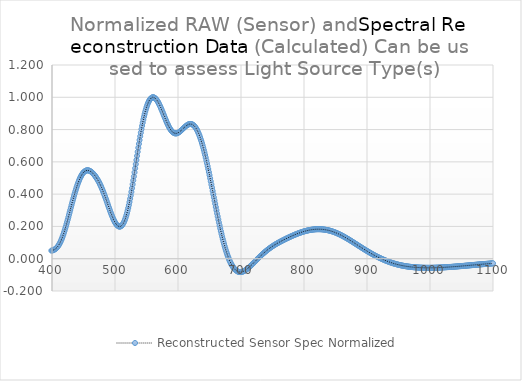
| Category | Reconstructed Sensor Spec Normalized |
|---|---|
| 380.0 | 0.041 |
| 381.0 | 0.041 |
| 382.0 | 0.042 |
| 383.0 | 0.042 |
| 384.0 | 0.042 |
| 385.0 | 0.043 |
| 386.0 | 0.043 |
| 387.0 | 0.044 |
| 388.0 | 0.044 |
| 389.0 | 0.045 |
| 390.0 | 0.045 |
| 391.0 | 0.046 |
| 392.0 | 0.046 |
| 393.0 | 0.047 |
| 394.0 | 0.047 |
| 395.0 | 0.047 |
| 396.0 | 0.048 |
| 397.0 | 0.049 |
| 398.0 | 0.049 |
| 399.0 | 0.05 |
| 400.0 | 0.051 |
| 401.0 | 0.052 |
| 402.0 | 0.053 |
| 403.0 | 0.055 |
| 404.0 | 0.057 |
| 405.0 | 0.059 |
| 406.0 | 0.062 |
| 407.0 | 0.066 |
| 408.0 | 0.07 |
| 409.0 | 0.075 |
| 410.0 | 0.08 |
| 411.0 | 0.086 |
| 412.0 | 0.093 |
| 413.0 | 0.101 |
| 414.0 | 0.109 |
| 415.0 | 0.118 |
| 416.0 | 0.128 |
| 417.0 | 0.138 |
| 418.0 | 0.15 |
| 419.0 | 0.161 |
| 420.0 | 0.174 |
| 421.0 | 0.187 |
| 422.0 | 0.2 |
| 423.0 | 0.214 |
| 424.0 | 0.228 |
| 425.0 | 0.242 |
| 426.0 | 0.257 |
| 427.0 | 0.272 |
| 428.0 | 0.287 |
| 429.0 | 0.302 |
| 430.0 | 0.317 |
| 431.0 | 0.332 |
| 432.0 | 0.347 |
| 433.0 | 0.361 |
| 434.0 | 0.376 |
| 435.0 | 0.39 |
| 436.0 | 0.404 |
| 437.0 | 0.417 |
| 438.0 | 0.43 |
| 439.0 | 0.442 |
| 440.0 | 0.454 |
| 441.0 | 0.465 |
| 442.0 | 0.476 |
| 443.0 | 0.486 |
| 444.0 | 0.495 |
| 445.0 | 0.503 |
| 446.0 | 0.511 |
| 447.0 | 0.518 |
| 448.0 | 0.524 |
| 449.0 | 0.53 |
| 450.0 | 0.535 |
| 451.0 | 0.538 |
| 452.0 | 0.542 |
| 453.0 | 0.544 |
| 454.0 | 0.546 |
| 455.0 | 0.547 |
| 456.0 | 0.548 |
| 457.0 | 0.547 |
| 458.0 | 0.547 |
| 459.0 | 0.546 |
| 460.0 | 0.544 |
| 461.0 | 0.542 |
| 462.0 | 0.539 |
| 463.0 | 0.536 |
| 464.0 | 0.533 |
| 465.0 | 0.529 |
| 466.0 | 0.525 |
| 467.0 | 0.52 |
| 468.0 | 0.515 |
| 469.0 | 0.51 |
| 470.0 | 0.504 |
| 471.0 | 0.498 |
| 472.0 | 0.492 |
| 473.0 | 0.485 |
| 474.0 | 0.478 |
| 475.0 | 0.471 |
| 476.0 | 0.463 |
| 477.0 | 0.455 |
| 478.0 | 0.446 |
| 479.0 | 0.437 |
| 480.0 | 0.428 |
| 481.0 | 0.418 |
| 482.0 | 0.408 |
| 483.0 | 0.397 |
| 484.0 | 0.387 |
| 485.0 | 0.376 |
| 486.0 | 0.365 |
| 487.0 | 0.354 |
| 488.0 | 0.343 |
| 489.0 | 0.332 |
| 490.0 | 0.32 |
| 491.0 | 0.309 |
| 492.0 | 0.299 |
| 493.0 | 0.288 |
| 494.0 | 0.278 |
| 495.0 | 0.268 |
| 496.0 | 0.258 |
| 497.0 | 0.249 |
| 498.0 | 0.241 |
| 499.0 | 0.233 |
| 500.0 | 0.225 |
| 501.0 | 0.219 |
| 502.0 | 0.213 |
| 503.0 | 0.209 |
| 504.0 | 0.205 |
| 505.0 | 0.202 |
| 506.0 | 0.2 |
| 507.0 | 0.199 |
| 508.0 | 0.199 |
| 509.0 | 0.2 |
| 510.0 | 0.203 |
| 511.0 | 0.207 |
| 512.0 | 0.212 |
| 513.0 | 0.218 |
| 514.0 | 0.225 |
| 515.0 | 0.234 |
| 516.0 | 0.244 |
| 517.0 | 0.255 |
| 518.0 | 0.268 |
| 519.0 | 0.282 |
| 520.0 | 0.298 |
| 521.0 | 0.314 |
| 522.0 | 0.332 |
| 523.0 | 0.351 |
| 524.0 | 0.371 |
| 525.0 | 0.392 |
| 526.0 | 0.414 |
| 527.0 | 0.437 |
| 528.0 | 0.461 |
| 529.0 | 0.485 |
| 530.0 | 0.51 |
| 531.0 | 0.535 |
| 532.0 | 0.56 |
| 533.0 | 0.586 |
| 534.0 | 0.611 |
| 535.0 | 0.637 |
| 536.0 | 0.662 |
| 537.0 | 0.687 |
| 538.0 | 0.711 |
| 539.0 | 0.735 |
| 540.0 | 0.758 |
| 541.0 | 0.781 |
| 542.0 | 0.802 |
| 543.0 | 0.823 |
| 544.0 | 0.843 |
| 545.0 | 0.861 |
| 546.0 | 0.879 |
| 547.0 | 0.895 |
| 548.0 | 0.911 |
| 549.0 | 0.925 |
| 550.0 | 0.938 |
| 551.0 | 0.949 |
| 552.0 | 0.96 |
| 553.0 | 0.969 |
| 554.0 | 0.977 |
| 555.0 | 0.984 |
| 556.0 | 0.989 |
| 557.0 | 0.994 |
| 558.0 | 0.997 |
| 559.0 | 0.999 |
| 560.0 | 1 |
| 561.0 | 1 |
| 562.0 | 0.999 |
| 563.0 | 0.997 |
| 564.0 | 0.993 |
| 565.0 | 0.989 |
| 566.0 | 0.985 |
| 567.0 | 0.979 |
| 568.0 | 0.973 |
| 569.0 | 0.966 |
| 570.0 | 0.958 |
| 571.0 | 0.95 |
| 572.0 | 0.942 |
| 573.0 | 0.933 |
| 574.0 | 0.923 |
| 575.0 | 0.914 |
| 576.0 | 0.904 |
| 577.0 | 0.894 |
| 578.0 | 0.885 |
| 579.0 | 0.875 |
| 580.0 | 0.865 |
| 581.0 | 0.856 |
| 582.0 | 0.847 |
| 583.0 | 0.838 |
| 584.0 | 0.83 |
| 585.0 | 0.822 |
| 586.0 | 0.814 |
| 587.0 | 0.807 |
| 588.0 | 0.801 |
| 589.0 | 0.795 |
| 590.0 | 0.791 |
| 591.0 | 0.786 |
| 592.0 | 0.783 |
| 593.0 | 0.78 |
| 594.0 | 0.778 |
| 595.0 | 0.777 |
| 596.0 | 0.776 |
| 597.0 | 0.776 |
| 598.0 | 0.777 |
| 599.0 | 0.778 |
| 600.0 | 0.78 |
| 601.0 | 0.782 |
| 602.0 | 0.785 |
| 603.0 | 0.788 |
| 604.0 | 0.791 |
| 605.0 | 0.795 |
| 606.0 | 0.798 |
| 607.0 | 0.802 |
| 608.0 | 0.806 |
| 609.0 | 0.81 |
| 610.0 | 0.813 |
| 611.0 | 0.817 |
| 612.0 | 0.82 |
| 613.0 | 0.823 |
| 614.0 | 0.826 |
| 615.0 | 0.829 |
| 616.0 | 0.831 |
| 617.0 | 0.833 |
| 618.0 | 0.834 |
| 619.0 | 0.834 |
| 620.0 | 0.835 |
| 621.0 | 0.834 |
| 622.0 | 0.833 |
| 623.0 | 0.831 |
| 624.0 | 0.829 |
| 625.0 | 0.826 |
| 626.0 | 0.822 |
| 627.0 | 0.817 |
| 628.0 | 0.812 |
| 629.0 | 0.806 |
| 630.0 | 0.799 |
| 631.0 | 0.791 |
| 632.0 | 0.783 |
| 633.0 | 0.773 |
| 634.0 | 0.763 |
| 635.0 | 0.753 |
| 636.0 | 0.741 |
| 637.0 | 0.729 |
| 638.0 | 0.716 |
| 639.0 | 0.703 |
| 640.0 | 0.689 |
| 641.0 | 0.674 |
| 642.0 | 0.658 |
| 643.0 | 0.642 |
| 644.0 | 0.626 |
| 645.0 | 0.609 |
| 646.0 | 0.592 |
| 647.0 | 0.574 |
| 648.0 | 0.556 |
| 649.0 | 0.537 |
| 650.0 | 0.518 |
| 651.0 | 0.499 |
| 652.0 | 0.479 |
| 653.0 | 0.46 |
| 654.0 | 0.44 |
| 655.0 | 0.42 |
| 656.0 | 0.4 |
| 657.0 | 0.38 |
| 658.0 | 0.36 |
| 659.0 | 0.34 |
| 660.0 | 0.32 |
| 661.0 | 0.301 |
| 662.0 | 0.281 |
| 663.0 | 0.262 |
| 664.0 | 0.243 |
| 665.0 | 0.224 |
| 666.0 | 0.206 |
| 667.0 | 0.188 |
| 668.0 | 0.171 |
| 669.0 | 0.154 |
| 670.0 | 0.138 |
| 671.0 | 0.122 |
| 672.0 | 0.107 |
| 673.0 | 0.093 |
| 674.0 | 0.079 |
| 675.0 | 0.065 |
| 676.0 | 0.052 |
| 677.0 | 0.04 |
| 678.0 | 0.028 |
| 679.0 | 0.017 |
| 680.0 | 0.007 |
| 681.0 | -0.003 |
| 682.0 | -0.012 |
| 683.0 | -0.021 |
| 684.0 | -0.029 |
| 685.0 | -0.036 |
| 686.0 | -0.043 |
| 687.0 | -0.049 |
| 688.0 | -0.055 |
| 689.0 | -0.06 |
| 690.0 | -0.065 |
| 691.0 | -0.069 |
| 692.0 | -0.072 |
| 693.0 | -0.075 |
| 694.0 | -0.077 |
| 695.0 | -0.079 |
| 696.0 | -0.081 |
| 697.0 | -0.082 |
| 698.0 | -0.082 |
| 699.0 | -0.083 |
| 700.0 | -0.082 |
| 701.0 | -0.082 |
| 702.0 | -0.081 |
| 703.0 | -0.079 |
| 704.0 | -0.078 |
| 705.0 | -0.076 |
| 706.0 | -0.074 |
| 707.0 | -0.071 |
| 708.0 | -0.069 |
| 709.0 | -0.066 |
| 710.0 | -0.063 |
| 711.0 | -0.059 |
| 712.0 | -0.056 |
| 713.0 | -0.053 |
| 714.0 | -0.049 |
| 715.0 | -0.045 |
| 716.0 | -0.042 |
| 717.0 | -0.038 |
| 718.0 | -0.034 |
| 719.0 | -0.03 |
| 720.0 | -0.026 |
| 721.0 | -0.022 |
| 722.0 | -0.018 |
| 723.0 | -0.014 |
| 724.0 | -0.01 |
| 725.0 | -0.006 |
| 726.0 | -0.002 |
| 727.0 | 0.002 |
| 728.0 | 0.005 |
| 729.0 | 0.009 |
| 730.0 | 0.013 |
| 731.0 | 0.017 |
| 732.0 | 0.02 |
| 733.0 | 0.024 |
| 734.0 | 0.028 |
| 735.0 | 0.031 |
| 736.0 | 0.035 |
| 737.0 | 0.038 |
| 738.0 | 0.042 |
| 739.0 | 0.045 |
| 740.0 | 0.048 |
| 741.0 | 0.051 |
| 742.0 | 0.054 |
| 743.0 | 0.058 |
| 744.0 | 0.061 |
| 745.0 | 0.063 |
| 746.0 | 0.066 |
| 747.0 | 0.069 |
| 748.0 | 0.072 |
| 749.0 | 0.075 |
| 750.0 | 0.077 |
| 751.0 | 0.08 |
| 752.0 | 0.082 |
| 753.0 | 0.085 |
| 754.0 | 0.087 |
| 755.0 | 0.089 |
| 756.0 | 0.092 |
| 757.0 | 0.094 |
| 758.0 | 0.096 |
| 759.0 | 0.098 |
| 760.0 | 0.101 |
| 761.0 | 0.103 |
| 762.0 | 0.105 |
| 763.0 | 0.107 |
| 764.0 | 0.109 |
| 765.0 | 0.111 |
| 766.0 | 0.113 |
| 767.0 | 0.115 |
| 768.0 | 0.117 |
| 769.0 | 0.119 |
| 770.0 | 0.121 |
| 771.0 | 0.123 |
| 772.0 | 0.125 |
| 773.0 | 0.127 |
| 774.0 | 0.128 |
| 775.0 | 0.13 |
| 776.0 | 0.132 |
| 777.0 | 0.134 |
| 778.0 | 0.136 |
| 779.0 | 0.138 |
| 780.0 | 0.139 |
| 781.0 | 0.141 |
| 782.0 | 0.143 |
| 783.0 | 0.144 |
| 784.0 | 0.146 |
| 785.0 | 0.148 |
| 786.0 | 0.149 |
| 787.0 | 0.151 |
| 788.0 | 0.153 |
| 789.0 | 0.154 |
| 790.0 | 0.156 |
| 791.0 | 0.157 |
| 792.0 | 0.159 |
| 793.0 | 0.16 |
| 794.0 | 0.161 |
| 795.0 | 0.163 |
| 796.0 | 0.164 |
| 797.0 | 0.165 |
| 798.0 | 0.167 |
| 799.0 | 0.168 |
| 800.0 | 0.169 |
| 801.0 | 0.17 |
| 802.0 | 0.171 |
| 803.0 | 0.172 |
| 804.0 | 0.173 |
| 805.0 | 0.174 |
| 806.0 | 0.175 |
| 807.0 | 0.176 |
| 808.0 | 0.177 |
| 809.0 | 0.178 |
| 810.0 | 0.178 |
| 811.0 | 0.179 |
| 812.0 | 0.18 |
| 813.0 | 0.18 |
| 814.0 | 0.181 |
| 815.0 | 0.181 |
| 816.0 | 0.182 |
| 817.0 | 0.182 |
| 818.0 | 0.182 |
| 819.0 | 0.182 |
| 820.0 | 0.183 |
| 821.0 | 0.183 |
| 822.0 | 0.183 |
| 823.0 | 0.183 |
| 824.0 | 0.183 |
| 825.0 | 0.183 |
| 826.0 | 0.183 |
| 827.0 | 0.182 |
| 828.0 | 0.182 |
| 829.0 | 0.182 |
| 830.0 | 0.182 |
| 831.0 | 0.181 |
| 832.0 | 0.181 |
| 833.0 | 0.18 |
| 834.0 | 0.179 |
| 835.0 | 0.179 |
| 836.0 | 0.178 |
| 837.0 | 0.177 |
| 838.0 | 0.176 |
| 839.0 | 0.176 |
| 840.0 | 0.175 |
| 841.0 | 0.174 |
| 842.0 | 0.172 |
| 843.0 | 0.171 |
| 844.0 | 0.17 |
| 845.0 | 0.169 |
| 846.0 | 0.168 |
| 847.0 | 0.166 |
| 848.0 | 0.165 |
| 849.0 | 0.163 |
| 850.0 | 0.162 |
| 851.0 | 0.16 |
| 852.0 | 0.158 |
| 853.0 | 0.157 |
| 854.0 | 0.155 |
| 855.0 | 0.153 |
| 856.0 | 0.151 |
| 857.0 | 0.15 |
| 858.0 | 0.148 |
| 859.0 | 0.146 |
| 860.0 | 0.144 |
| 861.0 | 0.142 |
| 862.0 | 0.139 |
| 863.0 | 0.137 |
| 864.0 | 0.135 |
| 865.0 | 0.133 |
| 866.0 | 0.131 |
| 867.0 | 0.128 |
| 868.0 | 0.126 |
| 869.0 | 0.124 |
| 870.0 | 0.122 |
| 871.0 | 0.119 |
| 872.0 | 0.117 |
| 873.0 | 0.114 |
| 874.0 | 0.112 |
| 875.0 | 0.11 |
| 876.0 | 0.107 |
| 877.0 | 0.105 |
| 878.0 | 0.102 |
| 879.0 | 0.1 |
| 880.0 | 0.097 |
| 881.0 | 0.095 |
| 882.0 | 0.092 |
| 883.0 | 0.09 |
| 884.0 | 0.087 |
| 885.0 | 0.085 |
| 886.0 | 0.082 |
| 887.0 | 0.08 |
| 888.0 | 0.077 |
| 889.0 | 0.075 |
| 890.0 | 0.072 |
| 891.0 | 0.07 |
| 892.0 | 0.067 |
| 893.0 | 0.065 |
| 894.0 | 0.062 |
| 895.0 | 0.06 |
| 896.0 | 0.057 |
| 897.0 | 0.055 |
| 898.0 | 0.053 |
| 899.0 | 0.05 |
| 900.0 | 0.048 |
| 901.0 | 0.046 |
| 902.0 | 0.043 |
| 903.0 | 0.041 |
| 904.0 | 0.039 |
| 905.0 | 0.036 |
| 906.0 | 0.034 |
| 907.0 | 0.032 |
| 908.0 | 0.03 |
| 909.0 | 0.027 |
| 910.0 | 0.025 |
| 911.0 | 0.023 |
| 912.0 | 0.021 |
| 913.0 | 0.019 |
| 914.0 | 0.017 |
| 915.0 | 0.015 |
| 916.0 | 0.013 |
| 917.0 | 0.011 |
| 918.0 | 0.009 |
| 919.0 | 0.007 |
| 920.0 | 0.005 |
| 921.0 | 0.003 |
| 922.0 | 0.001 |
| 923.0 | 0 |
| 924.0 | -0.002 |
| 925.0 | -0.004 |
| 926.0 | -0.006 |
| 927.0 | -0.007 |
| 928.0 | -0.009 |
| 929.0 | -0.01 |
| 930.0 | -0.012 |
| 931.0 | -0.014 |
| 932.0 | -0.015 |
| 933.0 | -0.017 |
| 934.0 | -0.018 |
| 935.0 | -0.02 |
| 936.0 | -0.021 |
| 937.0 | -0.022 |
| 938.0 | -0.024 |
| 939.0 | -0.025 |
| 940.0 | -0.026 |
| 941.0 | -0.028 |
| 942.0 | -0.029 |
| 943.0 | -0.03 |
| 944.0 | -0.031 |
| 945.0 | -0.032 |
| 946.0 | -0.033 |
| 947.0 | -0.034 |
| 948.0 | -0.035 |
| 949.0 | -0.036 |
| 950.0 | -0.037 |
| 951.0 | -0.038 |
| 952.0 | -0.039 |
| 953.0 | -0.04 |
| 954.0 | -0.041 |
| 955.0 | -0.042 |
| 956.0 | -0.043 |
| 957.0 | -0.043 |
| 958.0 | -0.044 |
| 959.0 | -0.045 |
| 960.0 | -0.045 |
| 961.0 | -0.046 |
| 962.0 | -0.047 |
| 963.0 | -0.047 |
| 964.0 | -0.048 |
| 965.0 | -0.049 |
| 966.0 | -0.049 |
| 967.0 | -0.05 |
| 968.0 | -0.05 |
| 969.0 | -0.051 |
| 970.0 | -0.051 |
| 971.0 | -0.051 |
| 972.0 | -0.052 |
| 973.0 | -0.052 |
| 974.0 | -0.053 |
| 975.0 | -0.053 |
| 976.0 | -0.053 |
| 977.0 | -0.054 |
| 978.0 | -0.054 |
| 979.0 | -0.054 |
| 980.0 | -0.054 |
| 981.0 | -0.055 |
| 982.0 | -0.055 |
| 983.0 | -0.055 |
| 984.0 | -0.055 |
| 985.0 | -0.055 |
| 986.0 | -0.056 |
| 987.0 | -0.056 |
| 988.0 | -0.056 |
| 989.0 | -0.056 |
| 990.0 | -0.056 |
| 991.0 | -0.056 |
| 992.0 | -0.056 |
| 993.0 | -0.056 |
| 994.0 | -0.056 |
| 995.0 | -0.056 |
| 996.0 | -0.056 |
| 997.0 | -0.056 |
| 998.0 | -0.056 |
| 999.0 | -0.056 |
| 1000.0 | -0.056 |
| 1001.0 | -0.056 |
| 1002.0 | -0.056 |
| 1003.0 | -0.056 |
| 1004.0 | -0.056 |
| 1005.0 | -0.056 |
| 1006.0 | -0.056 |
| 1007.0 | -0.056 |
| 1008.0 | -0.056 |
| 1009.0 | -0.056 |
| 1010.0 | -0.056 |
| 1011.0 | -0.055 |
| 1012.0 | -0.055 |
| 1013.0 | -0.055 |
| 1014.0 | -0.055 |
| 1015.0 | -0.055 |
| 1016.0 | -0.055 |
| 1017.0 | -0.054 |
| 1018.0 | -0.054 |
| 1019.0 | -0.054 |
| 1020.0 | -0.054 |
| 1021.0 | -0.054 |
| 1022.0 | -0.053 |
| 1023.0 | -0.053 |
| 1024.0 | -0.053 |
| 1025.0 | -0.053 |
| 1026.0 | -0.053 |
| 1027.0 | -0.052 |
| 1028.0 | -0.052 |
| 1029.0 | -0.052 |
| 1030.0 | -0.052 |
| 1031.0 | -0.051 |
| 1032.0 | -0.051 |
| 1033.0 | -0.051 |
| 1034.0 | -0.05 |
| 1035.0 | -0.05 |
| 1036.0 | -0.05 |
| 1037.0 | -0.05 |
| 1038.0 | -0.049 |
| 1039.0 | -0.049 |
| 1040.0 | -0.049 |
| 1041.0 | -0.048 |
| 1042.0 | -0.048 |
| 1043.0 | -0.048 |
| 1044.0 | -0.047 |
| 1045.0 | -0.047 |
| 1046.0 | -0.047 |
| 1047.0 | -0.046 |
| 1048.0 | -0.046 |
| 1049.0 | -0.046 |
| 1050.0 | -0.045 |
| 1051.0 | -0.045 |
| 1052.0 | -0.045 |
| 1053.0 | -0.044 |
| 1054.0 | -0.044 |
| 1055.0 | -0.044 |
| 1056.0 | -0.043 |
| 1057.0 | -0.043 |
| 1058.0 | -0.043 |
| 1059.0 | -0.042 |
| 1060.0 | -0.042 |
| 1061.0 | -0.042 |
| 1062.0 | -0.041 |
| 1063.0 | -0.041 |
| 1064.0 | -0.041 |
| 1065.0 | -0.04 |
| 1066.0 | -0.04 |
| 1067.0 | -0.04 |
| 1068.0 | -0.039 |
| 1069.0 | -0.039 |
| 1070.0 | -0.039 |
| 1071.0 | -0.038 |
| 1072.0 | -0.038 |
| 1073.0 | -0.037 |
| 1074.0 | -0.037 |
| 1075.0 | -0.037 |
| 1076.0 | -0.036 |
| 1077.0 | -0.036 |
| 1078.0 | -0.036 |
| 1079.0 | -0.035 |
| 1080.0 | -0.035 |
| 1081.0 | -0.035 |
| 1082.0 | -0.034 |
| 1083.0 | -0.034 |
| 1084.0 | -0.034 |
| 1085.0 | -0.033 |
| 1086.0 | -0.033 |
| 1087.0 | -0.033 |
| 1088.0 | -0.032 |
| 1089.0 | -0.032 |
| 1090.0 | -0.032 |
| 1091.0 | -0.031 |
| 1092.0 | -0.031 |
| 1093.0 | -0.031 |
| 1094.0 | -0.03 |
| 1095.0 | -0.03 |
| 1096.0 | -0.03 |
| 1097.0 | -0.03 |
| 1098.0 | -0.029 |
| 1099.0 | -0.029 |
| 1100.0 | -0.029 |